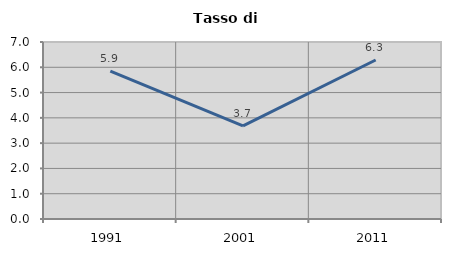
| Category | Tasso di disoccupazione   |
|---|---|
| 1991.0 | 5.852 |
| 2001.0 | 3.68 |
| 2011.0 | 6.287 |